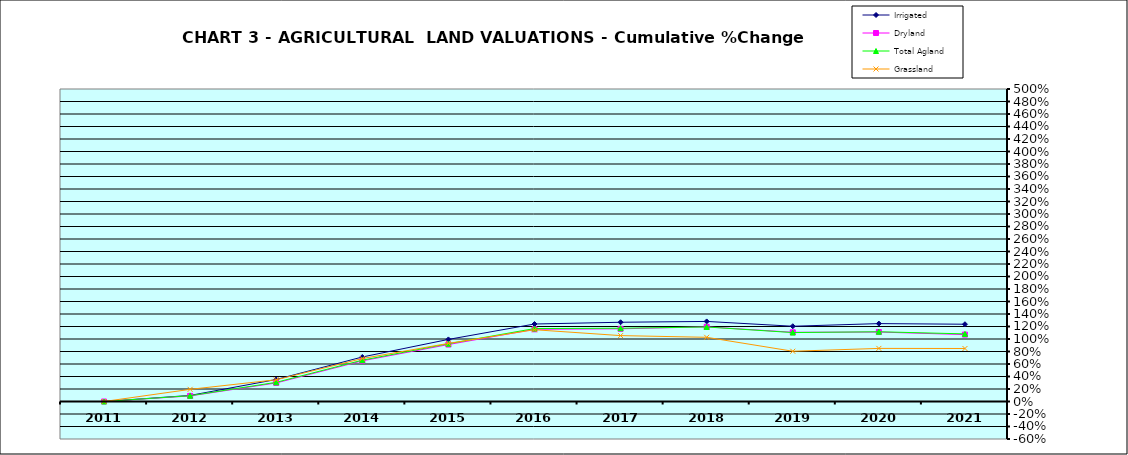
| Category | Irrigated | Dryland | Total Agland | Grassland |
|---|---|---|---|---|
| 2011.0 | 0 | 0 | 0 | 0 |
| 2012.0 | 0.097 | 0.089 | 0.093 | 0.194 |
| 2013.0 | 0.352 | 0.297 | 0.307 | 0.348 |
| 2014.0 | 0.712 | 0.651 | 0.661 | 0.687 |
| 2015.0 | 0.993 | 0.911 | 0.924 | 0.93 |
| 2016.0 | 1.24 | 1.155 | 1.167 | 1.148 |
| 2017.0 | 1.268 | 1.163 | 1.172 | 1.054 |
| 2018.0 | 1.281 | 1.194 | 1.192 | 1.027 |
| 2019.0 | 1.204 | 1.108 | 1.103 | 0.804 |
| 2020.0 | 1.246 | 1.111 | 1.116 | 0.85 |
| 2021.0 | 1.236 | 1.07 | 1.082 | 0.848 |